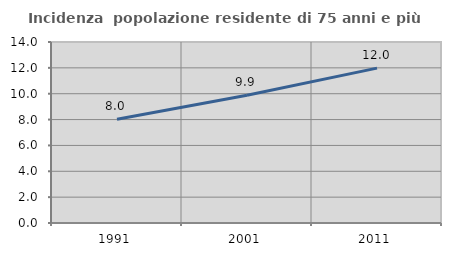
| Category | Incidenza  popolazione residente di 75 anni e più |
|---|---|
| 1991.0 | 8.024 |
| 2001.0 | 9.878 |
| 2011.0 | 11.982 |